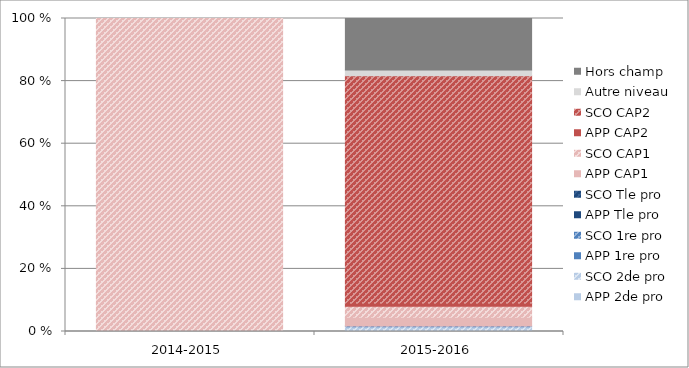
| Category | APP 2de pro | SCO 2de pro | APP 1re pro | SCO 1re pro | APP Tle pro | SCO Tle pro | APP CAP1 | SCO CAP1 | APP CAP2 | SCO CAP2 | Autre niveau | Hors champ |
|---|---|---|---|---|---|---|---|---|---|---|---|---|
| 2014-2015 | 0 | 0 | 0 | 0 | 0 | 0 | 0 | 100 | 0 | 0 | 0 | 0 |
| 2015-2016 | 0.13 | 1.36 | 0.02 | 0.21 | 0 | 0 | 2.85 | 3.49 | 0.93 | 72.73 | 1.84 | 16.45 |